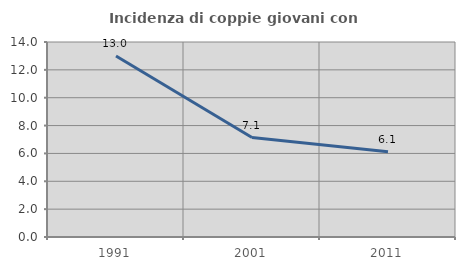
| Category | Incidenza di coppie giovani con figli |
|---|---|
| 1991.0 | 12.99 |
| 2001.0 | 7.143 |
| 2011.0 | 6.113 |